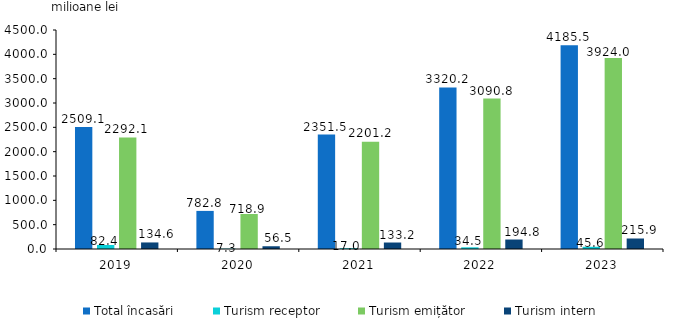
| Category | Total încasări | Turism receptor | Turism emițător | Turism intern |
|---|---|---|---|---|
| 2019.0 | 2509.1 | 82.4 | 2292.1 | 134.6 |
| 2020.0 | 782.8 | 7.32 | 718.93 | 56.52 |
| 2021.0 | 2351.45 | 17.02 | 2201.22 | 133.22 |
| 2022.0 | 3320.157 | 34.524 | 3090.807 | 194.826 |
| 2023.0 | 4185.497 | 45.603 | 3924.029 | 215.865 |